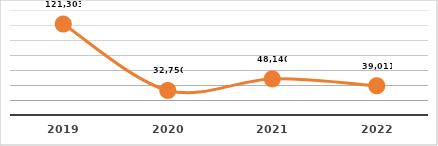
| Category | EVALUACIÓN DE COMPETENCIAS
PRIMER SEMESTRE, EJERCICIO 2022 |
|---|---|
| 2019.0 | 121303 |
| 2020.0 | 32750 |
| 2021.0 | 48140 |
| 2022.0 | 39011 |